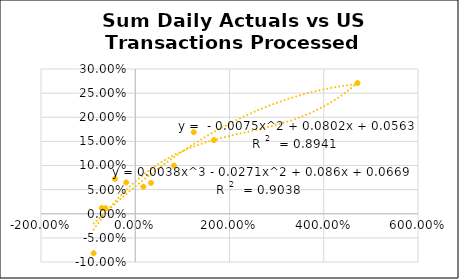
| Category | Series 0 |
|---|---|
| 0.17239811351109124 | 0.056 |
| 0.33404322204095216 | 0.064 |
| 0.821180231164947 | 0.1 |
| 1.2408262626173143 | 0.169 |
| 1.6708591888828779 | 0.153 |
| 4.716588495485591 | 0.271 |
| -0.4329639985031447 | 0.072 |
| -0.6321047553842531 | 0.012 |
| -0.709442159510233 | 0.012 |
| -0.8822239567959241 | -0.082 |
| -0.19201848995045334 | 0.065 |